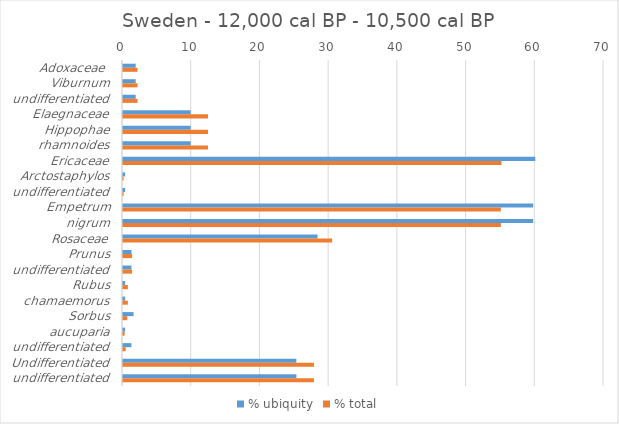
| Category | % ubiquity | % total |
|---|---|---|
| Adoxaceae  | 1.846 | 2.114 |
| Viburnum | 1.846 | 2.114 |
| undifferentiated | 1.846 | 2.114 |
| Elaegnaceae | 9.846 | 12.371 |
| Hippophae | 9.846 | 12.371 |
| rhamnoides | 9.846 | 12.371 |
| Ericaceae | 60 | 55.08 |
| Arctostaphylos | 0.308 | 0.091 |
| undifferentiated | 0.308 | 0.091 |
| Empetrum | 59.692 | 54.989 |
| nigrum | 59.692 | 54.989 |
| Rosaceae | 28.308 | 30.435 |
| Prunus | 1.231 | 1.317 |
| undifferentiated | 1.231 | 1.317 |
| Rubus | 0.308 | 0.707 |
| chamaemorus | 0.308 | 0.707 |
| Sorbus | 1.538 | 0.625 |
| aucuparia | 0.308 | 0.235 |
| undifferentiated | 1.231 | 0.39 |
| Undifferentiated | 25.231 | 27.786 |
| undifferentiated | 25.231 | 27.786 |